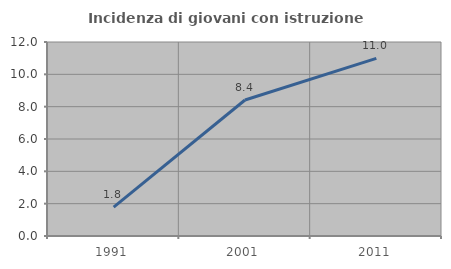
| Category | Incidenza di giovani con istruzione universitaria |
|---|---|
| 1991.0 | 1.786 |
| 2001.0 | 8.411 |
| 2011.0 | 10.989 |